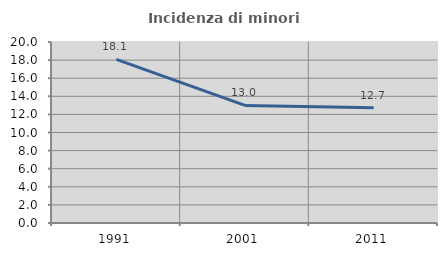
| Category | Incidenza di minori stranieri |
|---|---|
| 1991.0 | 18.085 |
| 2001.0 | 12.994 |
| 2011.0 | 12.727 |